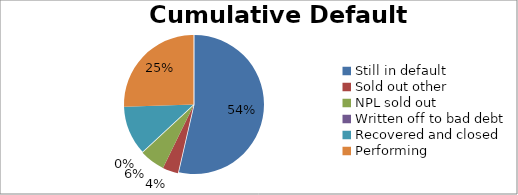
| Category | Cumulative Default Breakdown |
|---|---|
| Still in default | 0.536 |
| Sold out other | 0.036 |
| NPL sold out | 0.059 |
| Written off to bad debt | 0 |
| Recovered and closed | 0.114 |
| Performing | 0.255 |